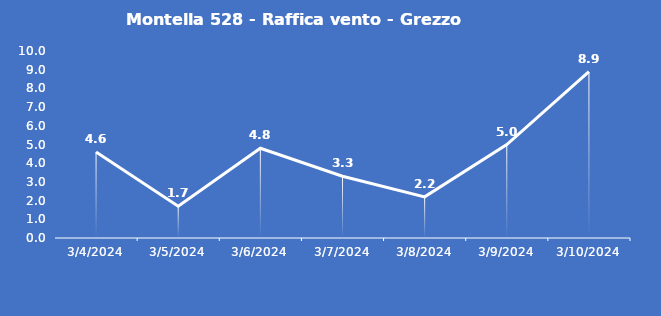
| Category | Montella 528 - Raffica vento - Grezzo (m/s) |
|---|---|
| 3/4/24 | 4.6 |
| 3/5/24 | 1.7 |
| 3/6/24 | 4.8 |
| 3/7/24 | 3.3 |
| 3/8/24 | 2.2 |
| 3/9/24 | 5 |
| 3/10/24 | 8.9 |